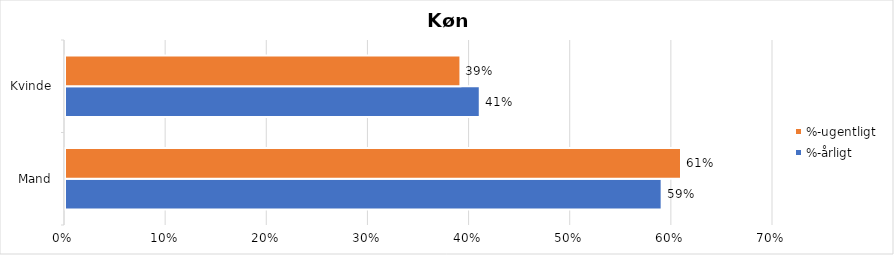
| Category | %-årligt | %-ugentligt |
|---|---|---|
| Mand | 0.59 | 0.609 |
| Kvinde | 0.41 | 0.391 |